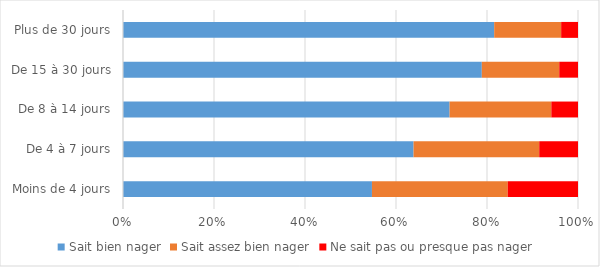
| Category | Sait bien nager | Sait assez bien nager | Ne sait pas ou presque pas nager  |
|---|---|---|---|
| Moins de 4 jours | 54.72 | 29.85 | 15.44 |
| De 4 à 7 jours | 63.86 | 27.62 | 8.52 |
| De 8 à 14 jours | 71.78 | 22.36 | 5.86 |
| De 15 à 30 jours | 78.87 | 17.02 | 4.12 |
| Plus de 30 jours | 81.57 | 14.72 | 3.7 |